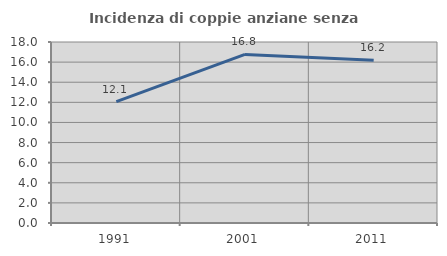
| Category | Incidenza di coppie anziane senza figli  |
|---|---|
| 1991.0 | 12.069 |
| 2001.0 | 16.766 |
| 2011.0 | 16.197 |